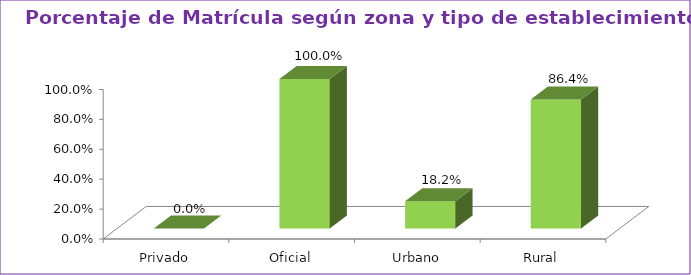
| Category | Series 1 |
|---|---|
| Privado | 0 |
| Oficial | 1 |
| Urbano | 0.182 |
| Rural | 0.864 |